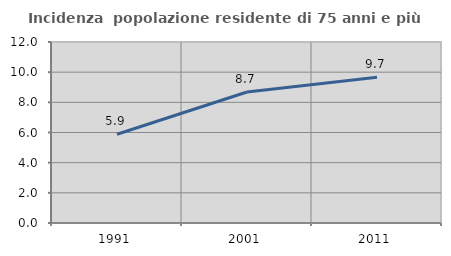
| Category | Incidenza  popolazione residente di 75 anni e più |
|---|---|
| 1991.0 | 5.885 |
| 2001.0 | 8.687 |
| 2011.0 | 9.67 |